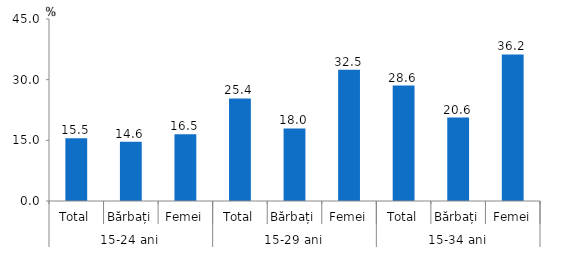
| Category | Series 0 |
|---|---|
| 0 | 15.538 |
| 1 | 14.643 |
| 2 | 16.492 |
| 3 | 25.373 |
| 4 | 17.953 |
| 5 | 32.47 |
| 6 | 28.552 |
| 7 | 20.626 |
| 8 | 36.246 |